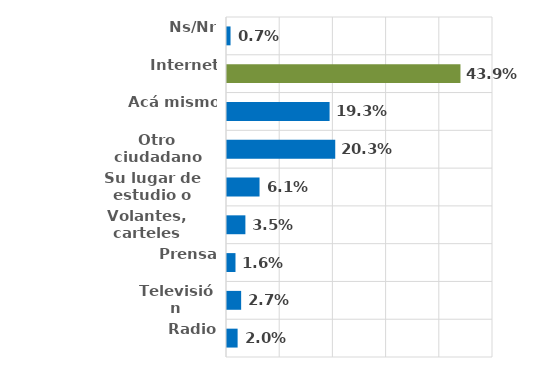
| Category | Series 0 |
|---|---|
| Radio | 0.02 |
| Televisión | 0.027 |
| Prensa | 0.016 |
| Volantes, carteles | 0.035 |
| Su lugar de estudio o trabajo | 0.061 |
| Otro ciudadano | 0.203 |
| Acá mismo | 0.193 |
| Internet | 0.439 |
| Ns/Nr | 0.007 |